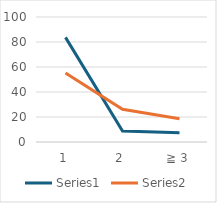
| Category | Series 0 | Series 1 |
|---|---|---|
| 1 | 83.706 | 55.273 |
| 2 | 8.85 | 26.116 |
| ≧ 3 | 7.444 | 18.611 |